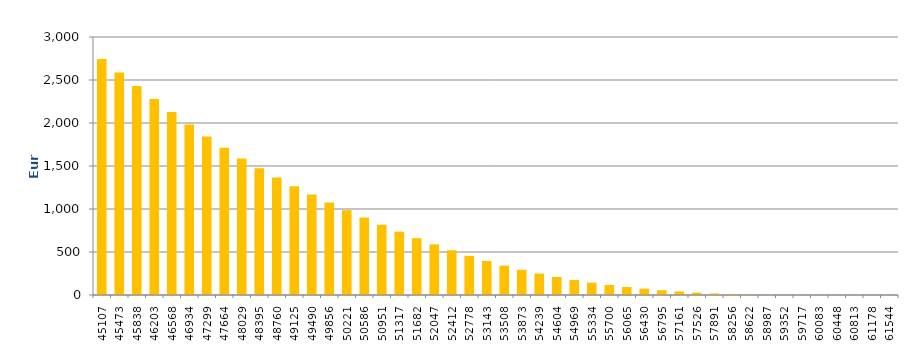
| Category | Series 0 |
|---|---|
| 45107.0 | 2744.39 |
| 45473.0 | 2586.463 |
| 45838.0 | 2430.916 |
| 46203.0 | 2277.768 |
| 46568.0 | 2127.418 |
| 46934.0 | 1981.898 |
| 47299.0 | 1842.851 |
| 47664.0 | 1711.235 |
| 48029.0 | 1587.829 |
| 48395.0 | 1472.444 |
| 48760.0 | 1365.901 |
| 49125.0 | 1265.153 |
| 49490.0 | 1168.652 |
| 49856.0 | 1075.776 |
| 50221.0 | 986.222 |
| 50586.0 | 899.812 |
| 50951.0 | 816.631 |
| 51317.0 | 736.689 |
| 51682.0 | 660.673 |
| 52047.0 | 588.598 |
| 52412.0 | 520.254 |
| 52778.0 | 455.827 |
| 53143.0 | 395.805 |
| 53508.0 | 341.662 |
| 53873.0 | 293.142 |
| 54239.0 | 249.361 |
| 54604.0 | 209.613 |
| 54969.0 | 174.032 |
| 55334.0 | 142.903 |
| 55700.0 | 116.236 |
| 56065.0 | 93.232 |
| 56430.0 | 73.222 |
| 56795.0 | 55.811 |
| 57161.0 | 40.64 |
| 57526.0 | 27.835 |
| 57891.0 | 17.83 |
| 58256.0 | 10.265 |
| 58622.0 | 4.849 |
| 58987.0 | 1.637 |
| 59352.0 | 0.34 |
| 59717.0 | 0.021 |
| 60083.0 | 0.013 |
| 60448.0 | 0.01 |
| 60813.0 | 0.007 |
| 61178.0 | 0.006 |
| 61544.0 | 0.004 |